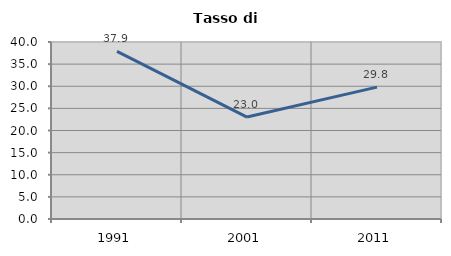
| Category | Tasso di disoccupazione   |
|---|---|
| 1991.0 | 37.887 |
| 2001.0 | 23.041 |
| 2011.0 | 29.804 |